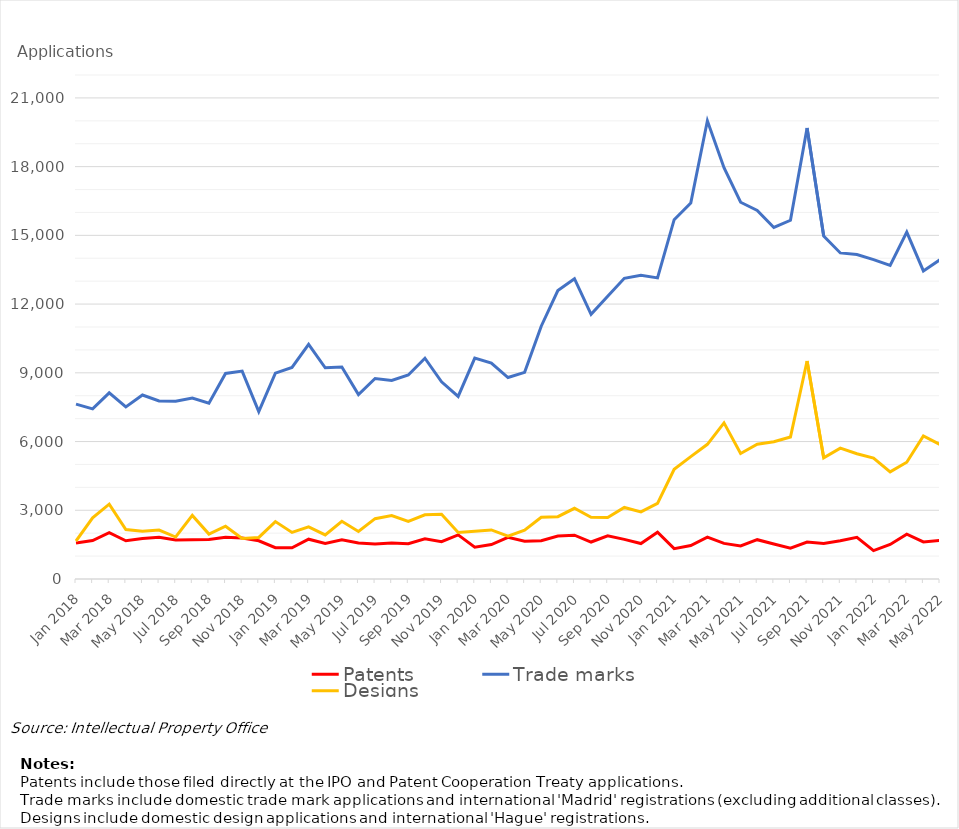
| Category | Patents | Trade marks | Designs |
|---|---|---|---|
| Jan 2018 | 1575 | 7634 | 1658 |
| Feb 2018 | 1676 | 7428 | 2672 |
| Mar 2018 | 2022 | 8127 | 3267 |
| Apr 2018 | 1670 | 7512 | 2160 |
| May 2018 | 1767 | 8030 | 2083 |
| Jun 2018 | 1821 | 7769 | 2136 |
| Jul 2018 | 1704 | 7757 | 1832 |
| Aug 2018 | 1713 | 7897 | 2777 |
| Sep 2018 | 1725 | 7673 | 1960 |
| Oct 2018 | 1818 | 8972 | 2302 |
| Nov 2018 | 1787 | 9076 | 1765 |
| Dec 2018 | 1670 | 7304 | 1815 |
| Jan 2019 | 1367 | 8985 | 2505 |
| Feb 2019 | 1361 | 9234 | 2031 |
| Mar 2019 | 1737 | 10243 | 2274 |
| Apr 2019 | 1552 | 9219 | 1923 |
| May 2019 | 1710 | 9251 | 2520 |
| Jun 2019 | 1569 | 8053 | 2074 |
| Jul 2019 | 1527 | 8752 | 2634 |
| Aug 2019 | 1571 | 8670 | 2768 |
| Sep 2019 | 1540 | 8907 | 2511 |
| Oct 2019 | 1755 | 9636 | 2800 |
| Nov 2019 | 1630 | 8607 | 2827 |
| Dec 2019 | 1926 | 7970 | 2028 |
| Jan 2020 | 1391 | 9642 | 2082 |
| Feb 2020 | 1505 | 9428 | 2143 |
| Mar 2020 | 1818 | 8794 | 1872 |
| Apr 2020 | 1648 | 9021 | 2127 |
| May 2020 | 1672 | 11035 | 2695 |
| Jun 2020 | 1879 | 12593 | 2721 |
| Jul 2020 | 1912 | 13110 | 3086 |
| Aug 2020 | 1614 | 11551 | 2694 |
| Sep 2020 | 1885 | 12340 | 2686 |
| Oct 2020 | 1730 | 13126 | 3124 |
| Nov 2020 | 1547 | 13254 | 2930 |
| Dec 2020 | 2042 | 13144 | 3302 |
| Jan 2021 | 1324 | 15685 | 4792 |
| Feb 2021 | 1462 | 16412 | 5341 |
| Mar 2021 | 1828 | 20001 | 5879 |
| Apr 2021 | 1554 | 17951 | 6815 |
| May 2021 | 1446 | 16446 | 5480 |
| Jun 2021 | 1716 | 16091 | 5881 |
| Jul 2021 | 1528 | 15345 | 5989 |
| Aug 2021 | 1344 | 15659 | 6200 |
| Sep 2021 | 1614 | 19685 | 9518 |
| Oct 2021 | 1547 | 14969 | 5289 |
| Nov 2021 | 1670 | 14233 | 5713 |
| Dec 2021 | 1817 | 14162 | 5466 |
| Jan 2022 | 1239 | 13943 | 5280 |
| Feb 2022 | 1507 | 13690 | 4679 |
| Mar 2022 | 1954 | 15140 | 5097 |
| Apr 2022 | 1618 | 13448 | 6248 |
| May 2022 | 1686 | 13937 | 5872 |